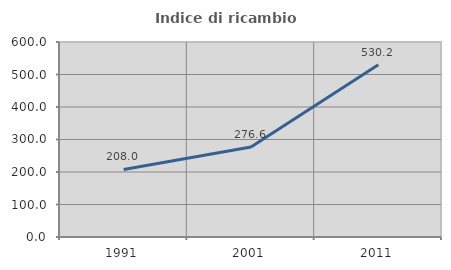
| Category | Indice di ricambio occupazionale  |
|---|---|
| 1991.0 | 207.971 |
| 2001.0 | 276.636 |
| 2011.0 | 530.189 |